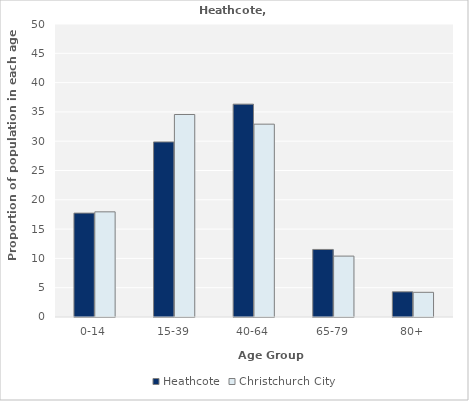
| Category | Heathcote | Christchurch City |
|---|---|---|
| 0-14 | 17.727 | 17.945 |
| 15-39 | 29.876 | 34.556 |
| 40-64 | 36.322 | 32.907 |
| 65-79 | 11.529 | 10.392 |
| 80+ | 4.298 | 4.211 |